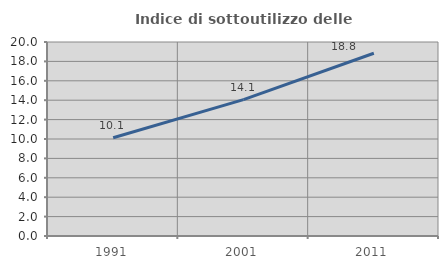
| Category | Indice di sottoutilizzo delle abitazioni  |
|---|---|
| 1991.0 | 10.131 |
| 2001.0 | 14.054 |
| 2011.0 | 18.838 |